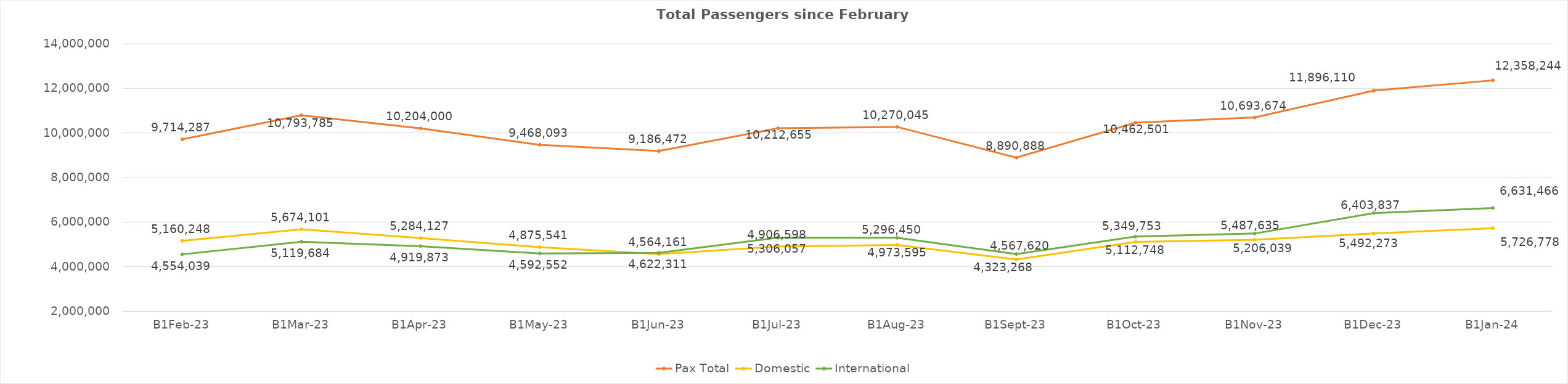
| Category | Pax Total | Domestic | International |
|---|---|---|---|
| 2023-02-01 | 9714287 | 5160248 | 4554039 |
| 2023-03-01 | 10793785 | 5674101 | 5119684 |
| 2023-04-01 | 10204000 | 5284127 | 4919873 |
| 2023-05-01 | 9468093 | 4875541 | 4592552 |
| 2023-06-01 | 9186472 | 4564161 | 4622311 |
| 2023-07-01 | 10212655 | 4906598 | 5306057 |
| 2023-08-01 | 10270045 | 4973595 | 5296450 |
| 2023-09-01 | 8890888 | 4323268 | 4567620 |
| 2023-10-01 | 10462501 | 5112748 | 5349753 |
| 2023-11-01 | 10693674 | 5206039 | 5487635 |
| 2023-12-01 | 11896110 | 5492273 | 6403837 |
| 2024-01-01 | 12358244 | 5726778 | 6631466 |